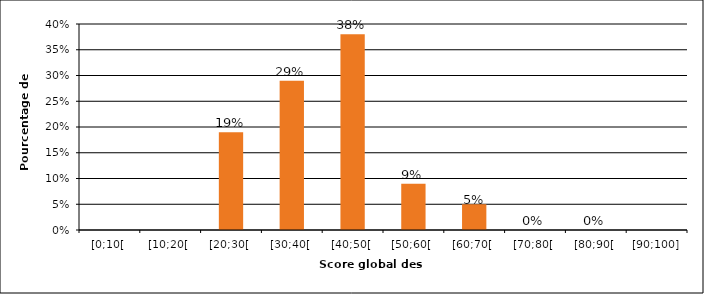
| Category | Series 1 |
|---|---|
| [0;10[ | 0 |
| [10;20[ | 0 |
| [20;30[ | 0.19 |
| [30;40[ | 0.29 |
| [40;50[ | 0.38 |
| [50;60[ | 0.09 |
| [60;70[ | 0.05 |
| [70;80[ | 0 |
| [80;90[ | 0 |
| [90;100] | 0 |